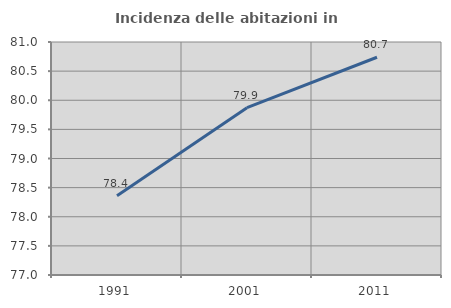
| Category | Incidenza delle abitazioni in proprietà  |
|---|---|
| 1991.0 | 78.36 |
| 2001.0 | 79.873 |
| 2011.0 | 80.738 |